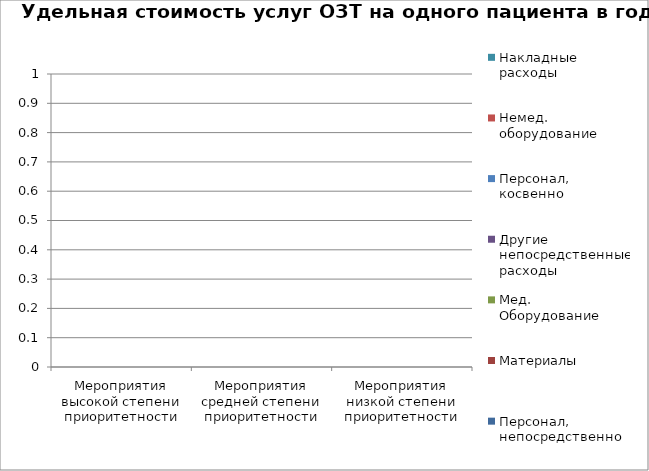
| Category | Персонал, непосредственно оказывающий услуги | Материалы | Мед. оборудование | Другие непосредственные расходы | Персонал, косвенно участвующий в оказании услуг | Немед. оборудование | Накладные расходы | Персонал, непосредственно | Мед. Оборудование | Персонал, косвенно |
|---|---|---|---|---|---|---|---|---|---|---|
| Мероприятия высокой степени приоритетности | 0 |  | 0 |  | 0 |  |  |  |  |  |
| Мероприятия средней степени приоритетности | 0 |  | 0 |  | 0 |  |  |  |  |  |
| Мероприятия низкой степени приоритетности | 0 |  | 0 |  | 0 |  |  |  |  |  |